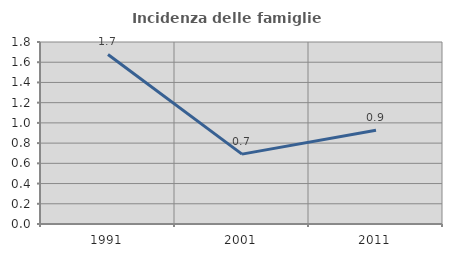
| Category | Incidenza delle famiglie numerose |
|---|---|
| 1991.0 | 1.677 |
| 2001.0 | 0.691 |
| 2011.0 | 0.927 |